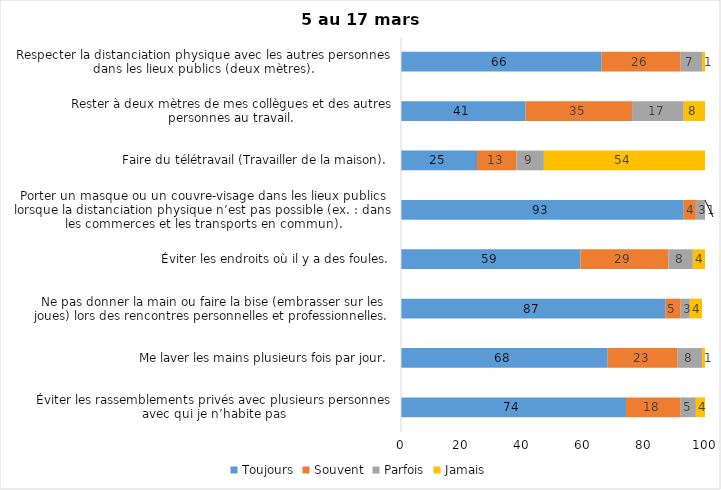
| Category | Toujours | Souvent | Parfois | Jamais |
|---|---|---|---|---|
| Éviter les rassemblements privés avec plusieurs personnes avec qui je n’habite pas | 74 | 18 | 5 | 4 |
| Me laver les mains plusieurs fois par jour. | 68 | 23 | 8 | 1 |
| Ne pas donner la main ou faire la bise (embrasser sur les joues) lors des rencontres personnelles et professionnelles. | 87 | 5 | 3 | 4 |
| Éviter les endroits où il y a des foules. | 59 | 29 | 8 | 4 |
| Porter un masque ou un couvre-visage dans les lieux publics lorsque la distanciation physique n’est pas possible (ex. : dans les commerces et les transports en commun). | 93 | 4 | 3 | 1 |
| Faire du télétravail (Travailler de la maison). | 25 | 13 | 9 | 54 |
| Rester à deux mètres de mes collègues et des autres personnes au travail. | 41 | 35 | 17 | 8 |
| Respecter la distanciation physique avec les autres personnes dans les lieux publics (deux mètres). | 66 | 26 | 7 | 1 |